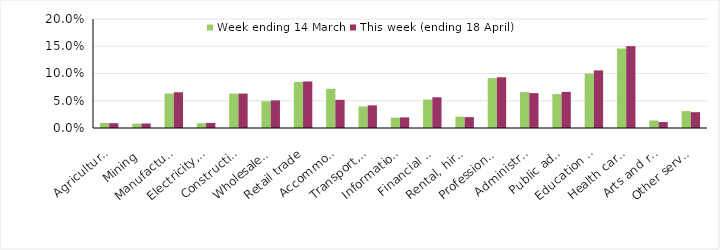
| Category | Week ending 14 March | This week (ending 18 April) |
|---|---|---|
| Agriculture, forestry and fishing | 0.009 | 0.009 |
| Mining | 0.008 | 0.008 |
| Manufacturing | 0.063 | 0.066 |
| Electricity, gas, water and waste services | 0.009 | 0.009 |
| Construction | 0.063 | 0.063 |
| Wholesale trade | 0.049 | 0.051 |
| Retail trade | 0.084 | 0.085 |
| Accommodation and food services | 0.072 | 0.052 |
| Transport, postal and warehousing | 0.04 | 0.042 |
| Information media and telecommunications | 0.019 | 0.019 |
| Financial and insurance services | 0.052 | 0.056 |
| Rental, hiring and real estate services | 0.021 | 0.02 |
| Professional, scientific and technical services | 0.091 | 0.093 |
| Administrative and support services | 0.066 | 0.064 |
| Public administration and safety | 0.062 | 0.066 |
| Education and training | 0.1 | 0.106 |
| Health care and social assistance | 0.146 | 0.15 |
| Arts and recreation services | 0.014 | 0.011 |
| Other services | 0.031 | 0.029 |